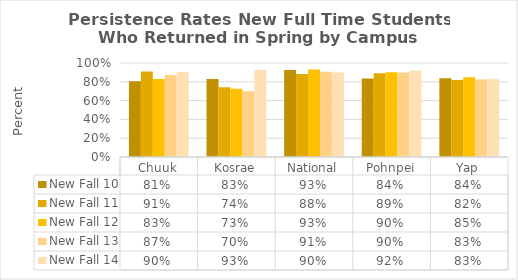
| Category | New Fall 10 | New Fall 11 | New Fall 12 | New Fall 13 | New Fall 14 |
|---|---|---|---|---|---|
| Chuuk | 0.807 | 0.91 | 0.83 | 0.872 | 0.904 |
| Kosrae | 0.829 | 0.741 | 0.727 | 0.7 | 0.929 |
| National | 0.926 | 0.883 | 0.93 | 0.906 | 0.899 |
| Pohnpei | 0.835 | 0.892 | 0.902 | 0.9 | 0.919 |
| Yap | 0.837 | 0.818 | 0.849 | 0.825 | 0.833 |